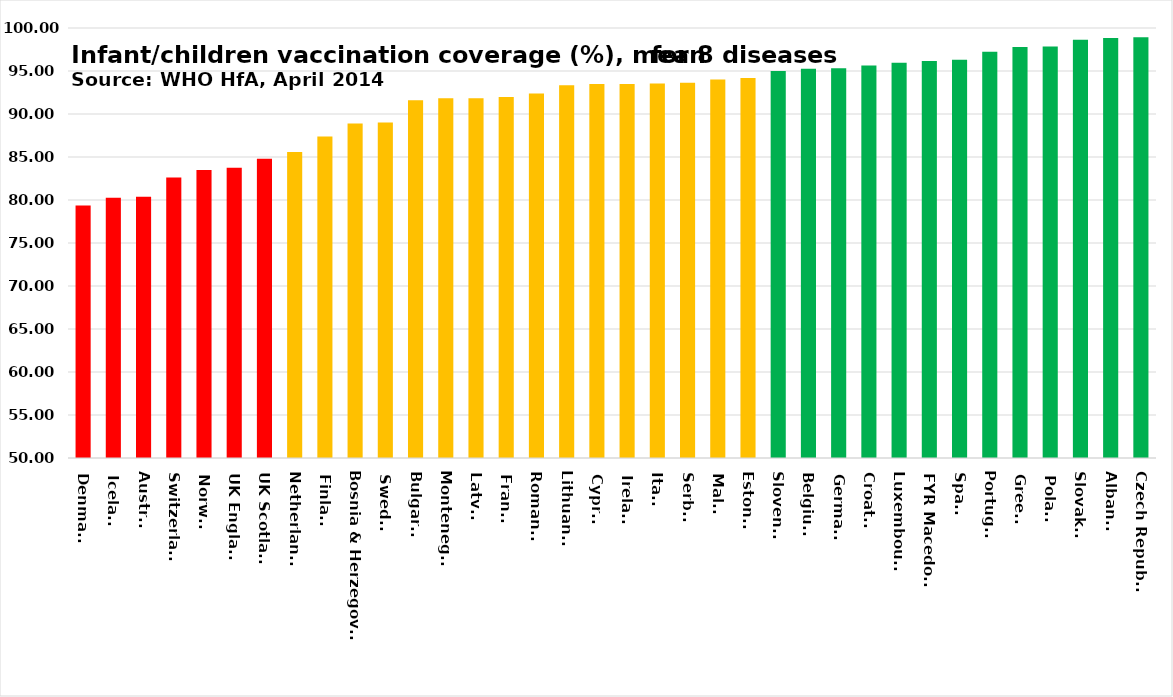
| Category | Series 0 |
|---|---|
| Denmark | 79.375 |
| Iceland | 80.25 |
| Austria | 80.375 |
| Switzerland | 82.625 |
| Norway | 83.5 |
| UK England | 83.75 |
| UK Scotland | 84.788 |
| Netherlands | 85.595 |
| Finland | 87.375 |
| Bosnia & Herzegovina | 88.9 |
| Sweden | 89 |
| Bulgaria | 91.613 |
| Montenegro | 91.825 |
| Latvia | 91.825 |
| France | 91.988 |
| Romania | 92.375 |
| Lithuania | 93.34 |
| Cyprus | 93.5 |
| Ireland | 93.5 |
| Italy | 93.538 |
| Serbia | 93.625 |
| Malta | 94.025 |
| Estonia | 94.188 |
| Slovenia | 95 |
| Belgium | 95.25 |
| Germany | 95.325 |
| Croatia | 95.64 |
| Luxembourg | 95.95 |
| FYR Macedonia | 96.152 |
| Spain | 96.312 |
| Portugal | 97.25 |
| Greece | 97.8 |
| Poland | 97.85 |
| Slovakia | 98.625 |
| Albania | 98.85 |
| Czech Republic | 98.91 |